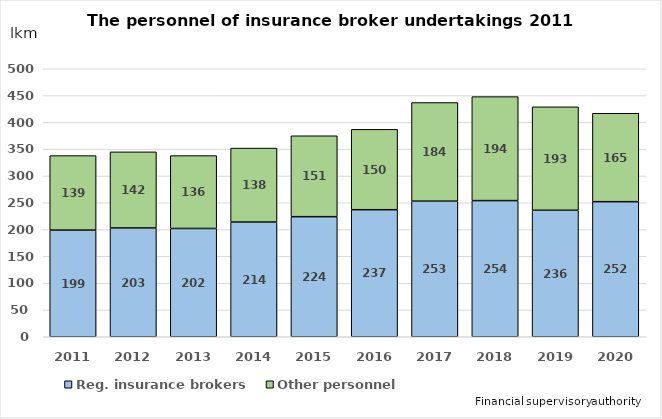
| Category | Reg. insurance brokers | Other personnel |
|---|---|---|
| 2011.0 | 199 | 139 |
| 2012.0 | 203 | 142 |
| 2013.0 | 202 | 136 |
| 2014.0 | 214 | 138 |
| 2015.0 | 224 | 151 |
| 2016.0 | 237 | 150 |
| 2017.0 | 253 | 184 |
| 2018.0 | 254 | 194 |
| 2019.0 | 236 | 193 |
| 2020.0 | 252 | 165 |